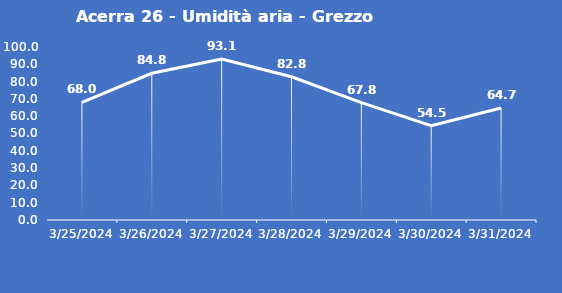
| Category | Acerra 26 - Umidità aria - Grezzo (%) |
|---|---|
| 3/25/24 | 68 |
| 3/26/24 | 84.8 |
| 3/27/24 | 93.1 |
| 3/28/24 | 82.8 |
| 3/29/24 | 67.8 |
| 3/30/24 | 54.5 |
| 3/31/24 | 64.7 |